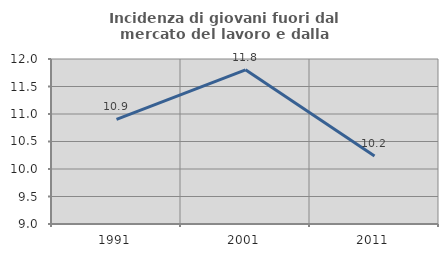
| Category | Incidenza di giovani fuori dal mercato del lavoro e dalla formazione  |
|---|---|
| 1991.0 | 10.9 |
| 2001.0 | 11.803 |
| 2011.0 | 10.236 |